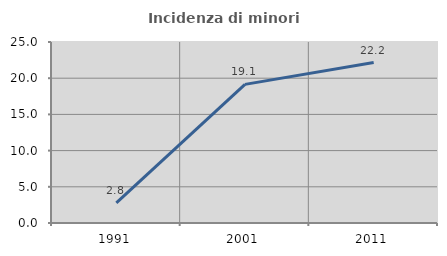
| Category | Incidenza di minori stranieri |
|---|---|
| 1991.0 | 2.778 |
| 2001.0 | 19.149 |
| 2011.0 | 22.167 |